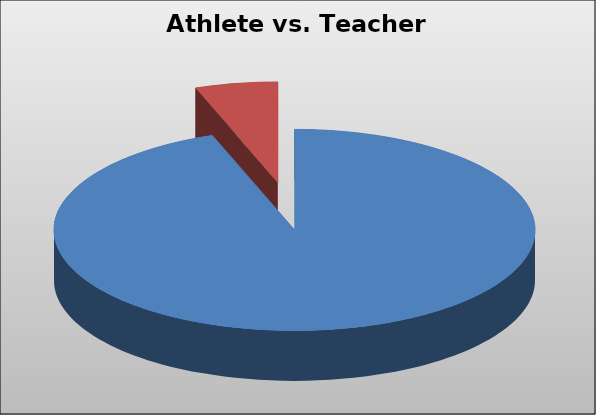
| Category | Series 0 |
|---|---|
| Teachers | 173693545470 |
| Athletes | 10219773198 |